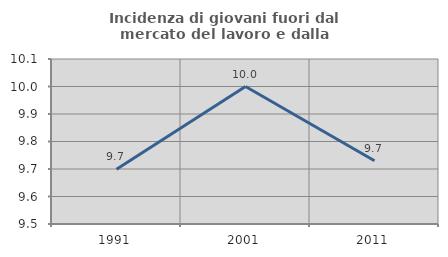
| Category | Incidenza di giovani fuori dal mercato del lavoro e dalla formazione  |
|---|---|
| 1991.0 | 9.699 |
| 2001.0 | 10 |
| 2011.0 | 9.73 |